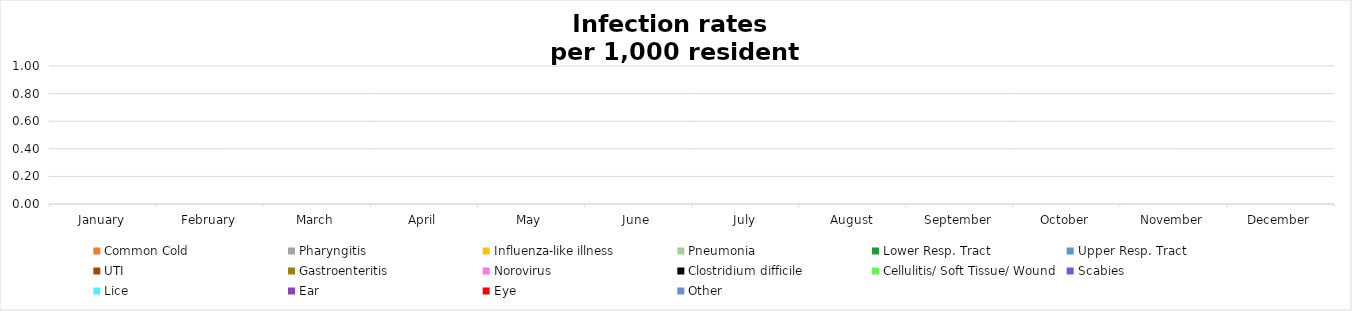
| Category | Common Cold | Pharyngitis | Influenza-like illness | Pneumonia | Lower Resp. Tract | Upper Resp. Tract | UTI | Gastroenteritis | Norovirus | Clostridium difficile | Cellulitis/ Soft Tissue/ Wound | Scabies | Lice | Ear | Eye | Other |
|---|---|---|---|---|---|---|---|---|---|---|---|---|---|---|---|---|
| January | 0 | 0 | 0 | 0 | 0 | 0 | 0 | 0 | 0 | 0 | 0 | 0 | 0 | 0 | 0 | 0 |
| February | 0 | 0 | 0 | 0 | 0 | 0 | 0 | 0 | 0 | 0 | 0 | 0 | 0 | 0 | 0 | 0 |
| March | 0 | 0 | 0 | 0 | 0 | 0 | 0 | 0 | 0 | 0 | 0 | 0 | 0 | 0 | 0 | 0 |
| April | 0 | 0 | 0 | 0 | 0 | 0 | 0 | 0 | 0 | 0 | 0 | 0 | 0 | 0 | 0 | 0 |
| May | 0 | 0 | 0 | 0 | 0 | 0 | 0 | 0 | 0 | 0 | 0 | 0 | 0 | 0 | 0 | 0 |
| June | 0 | 0 | 0 | 0 | 0 | 0 | 0 | 0 | 0 | 0 | 0 | 0 | 0 | 0 | 0 | 0 |
| July | 0 | 0 | 0 | 0 | 0 | 0 | 0 | 0 | 0 | 0 | 0 | 0 | 0 | 0 | 0 | 0 |
| August | 0 | 0 | 0 | 0 | 0 | 0 | 0 | 0 | 0 | 0 | 0 | 0 | 0 | 0 | 0 | 0 |
| September | 0 | 0 | 0 | 0 | 0 | 0 | 0 | 0 | 0 | 0 | 0 | 0 | 0 | 0 | 0 | 0 |
| October | 0 | 0 | 0 | 0 | 0 | 0 | 0 | 0 | 0 | 0 | 0 | 0 | 0 | 0 | 0 | 0 |
| November | 0 | 0 | 0 | 0 | 0 | 0 | 0 | 0 | 0 | 0 | 0 | 0 | 0 | 0 | 0 | 0 |
| December | 0 | 0 | 0 | 0 | 0 | 0 | 0 | 0 | 0 | 0 | 0 | 0 | 0 | 0 | 0 | 0 |